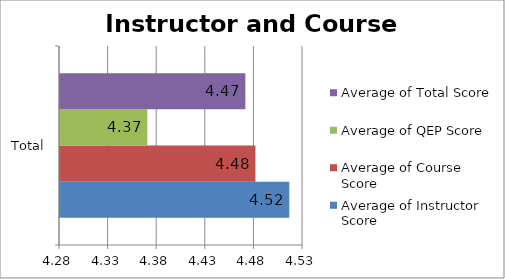
| Category | Average of Instructor Score | Average of Course Score | Average of QEP Score | Average of Total Score |
|---|---|---|---|---|
| Total | 4.516 | 4.481 | 4.37 | 4.471 |